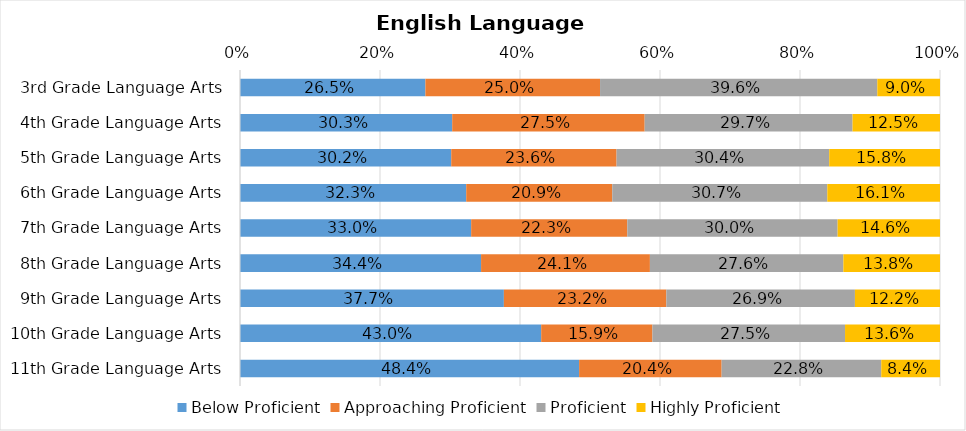
| Category | Below Proficient | Approaching Proficient | Proficient | Highly Proficient |
|---|---|---|---|---|
| 3rd Grade Language Arts | 0.265 | 0.25 | 0.396 | 0.09 |
| 4th Grade Language Arts | 0.303 | 0.275 | 0.297 | 0.125 |
| 5th Grade Language Arts | 0.302 | 0.236 | 0.304 | 0.158 |
| 6th Grade Language Arts | 0.323 | 0.209 | 0.307 | 0.161 |
| 7th Grade Language Arts | 0.33 | 0.223 | 0.3 | 0.146 |
| 8th Grade Language Arts | 0.344 | 0.241 | 0.276 | 0.138 |
| 9th Grade Language Arts | 0.377 | 0.232 | 0.269 | 0.122 |
| 10th Grade Language Arts | 0.43 | 0.159 | 0.275 | 0.136 |
| 11th Grade Language Arts | 0.484 | 0.204 | 0.228 | 0.084 |